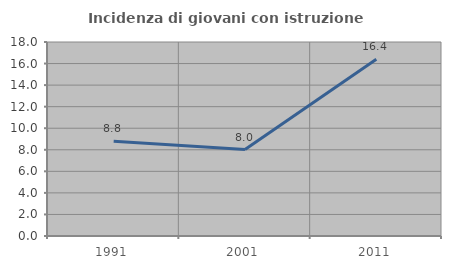
| Category | Incidenza di giovani con istruzione universitaria |
|---|---|
| 1991.0 | 8.791 |
| 2001.0 | 8.021 |
| 2011.0 | 16.393 |